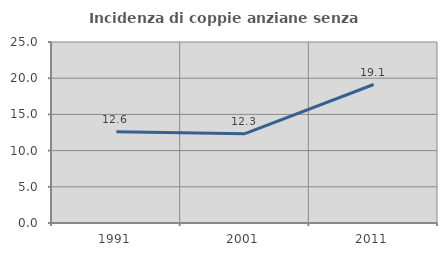
| Category | Incidenza di coppie anziane senza figli  |
|---|---|
| 1991.0 | 12.615 |
| 2001.0 | 12.338 |
| 2011.0 | 19.128 |